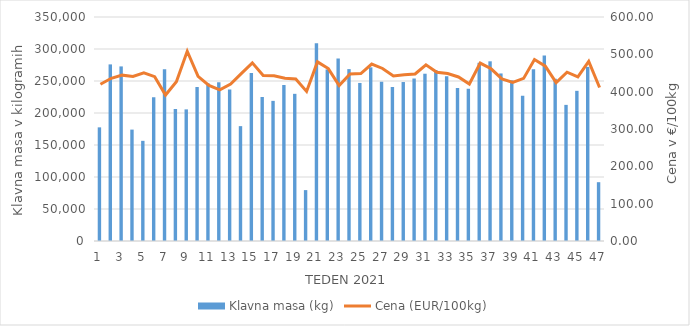
| Category | Klavna masa (kg) |
|---|---|
| 1.0 | 177573 |
| 2.0 | 275951 |
| 3.0 | 272797 |
| 4.0 | 174056 |
| 5.0 | 156508 |
| 6.0 | 224595 |
| 7.0 | 268436 |
| 8.0 | 206193 |
| 9.0 | 205669 |
| 10.0 | 240592 |
| 11.0 | 246325 |
| 12.0 | 248020 |
| 13.0 | 236703 |
| 14.0 | 179478 |
| 15.0 | 262544 |
| 16.0 | 225033 |
| 17.0 | 218950 |
| 18.0 | 243711 |
| 19.0 | 229955 |
| 20.0 | 79521 |
| 21.0 | 309134 |
| 22.0 | 268074 |
| 23.0 | 285151 |
| 24.0 | 268579 |
| 25.0 | 246944 |
| 26.0 | 271319 |
| 27.0 | 248858 |
| 28.0 | 240609 |
| 29.0 | 248383 |
| 30.0 | 253894 |
| 31.0 | 261374 |
| 32.0 | 267142 |
| 33.0 | 257352 |
| 34.0 | 239018 |
| 35.0 | 238034 |
| 36.0 | 278443 |
| 37.0 | 280772 |
| 38.0 | 261791 |
| 39.0 | 250972 |
| 40.0 | 226992 |
| 41.0 | 268523 |
| 42.0 | 289650 |
| 43.0 | 253458 |
| 44.0 | 212689 |
| 45.0 | 234635 |
| 46.0 | 272042 |
| 47.0 | 91884 |